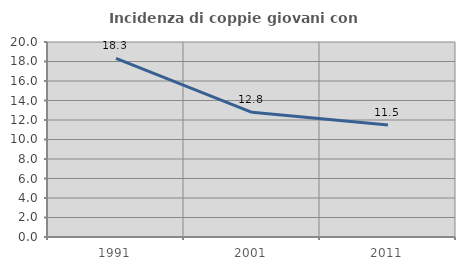
| Category | Incidenza di coppie giovani con figli |
|---|---|
| 1991.0 | 18.329 |
| 2001.0 | 12.786 |
| 2011.0 | 11.49 |